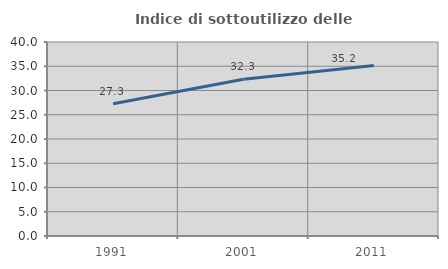
| Category | Indice di sottoutilizzo delle abitazioni  |
|---|---|
| 1991.0 | 27.266 |
| 2001.0 | 32.307 |
| 2011.0 | 35.172 |